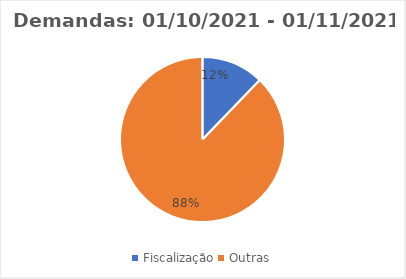
| Category | Saída |
|---|---|
| Fiscalização | 5 |
| Outras | 36 |